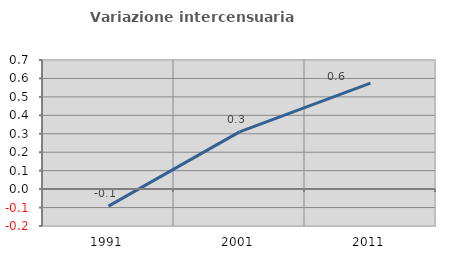
| Category | Variazione intercensuaria annua |
|---|---|
| 1991.0 | -0.092 |
| 2001.0 | 0.311 |
| 2011.0 | 0.575 |